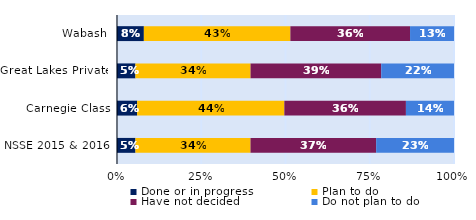
| Category | Done or in progress | Plan to do | Have not decided | Do not plan to do |
|---|---|---|---|---|
| Wabash | 0.08 | 0.435 | 0.355 | 0.13 |
| Great Lakes Private | 0.055 | 0.342 | 0.388 | 0.216 |
| Carnegie Class | 0.06 | 0.437 | 0.361 | 0.143 |
| NSSE 2015 & 2016 | 0.055 | 0.341 | 0.373 | 0.231 |